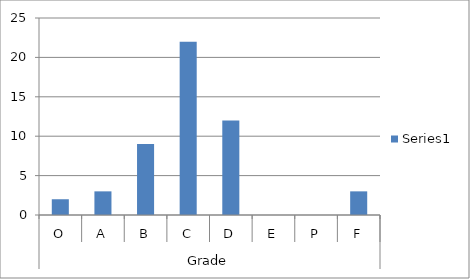
| Category | Series 0 |
|---|---|
| 0 | 2 |
| 1 | 3 |
| 2 | 9 |
| 3 | 22 |
| 4 | 12 |
| 5 | 0 |
| 6 | 0 |
| 7 | 3 |